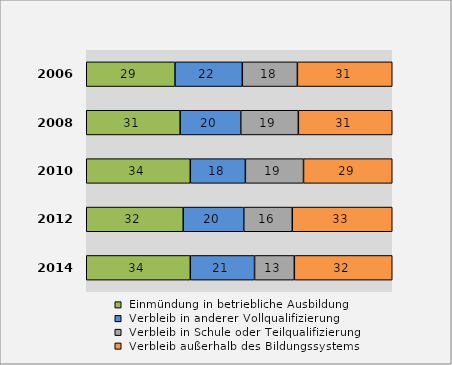
| Category |  Einmündung in betriebliche Ausbildung |  Verbleib in anderer Vollqualifizierung |  Verbleib in Schule oder Teilqualifizierung |  Verbleib außerhalb des Bildungssystems |
|---|---|---|---|---|
| 2014.0 | 34 | 21 | 13 | 32 |
| 2012.0 | 32 | 20 | 16 | 33 |
| 2010.0 | 34 | 18 | 19 | 29 |
| 2008.0 | 31 | 20 | 19 | 31 |
| 2006.0 | 29 | 22 | 18 | 31 |